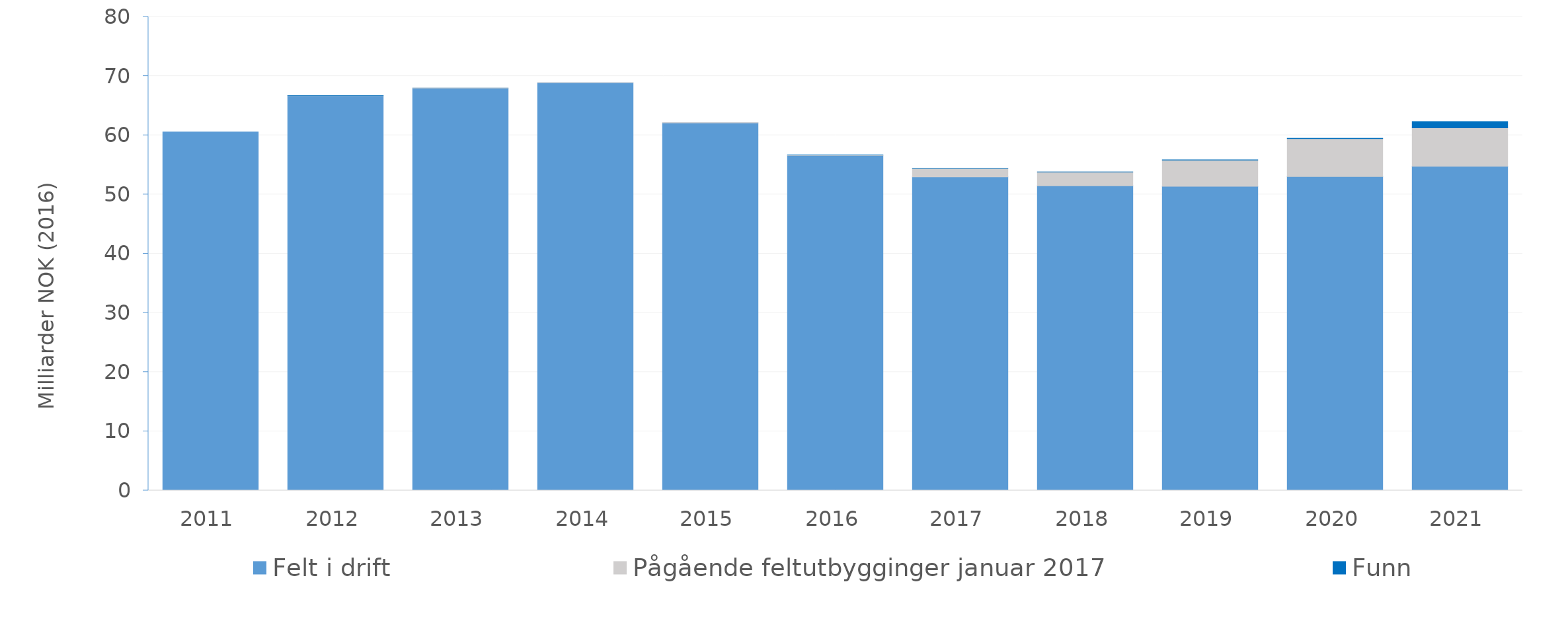
| Category | Felt i drift | Pågående feltutbygginger januar 2017 | Funn |
|---|---|---|---|
| 2011.0 | 60.569 | 0 | 0 |
| 2012.0 | 66.679 | 0.007 | 0.001 |
| 2013.0 | 67.976 | 0.009 | 0 |
| 2014.0 | 68.866 | 0.014 | 0 |
| 2015.0 | 62.1 | 0.033 | 0 |
| 2016.0 | 56.592 | 0.092 | 0.003 |
| 2017.0 | 52.98 | 1.42 | 0.003 |
| 2018.0 | 51.473 | 2.332 | 0.01 |
| 2019.0 | 51.373 | 4.44 | 0.018 |
| 2020.0 | 53.032 | 6.415 | 0.044 |
| 2021.0 | 54.763 | 6.491 | 1.051 |